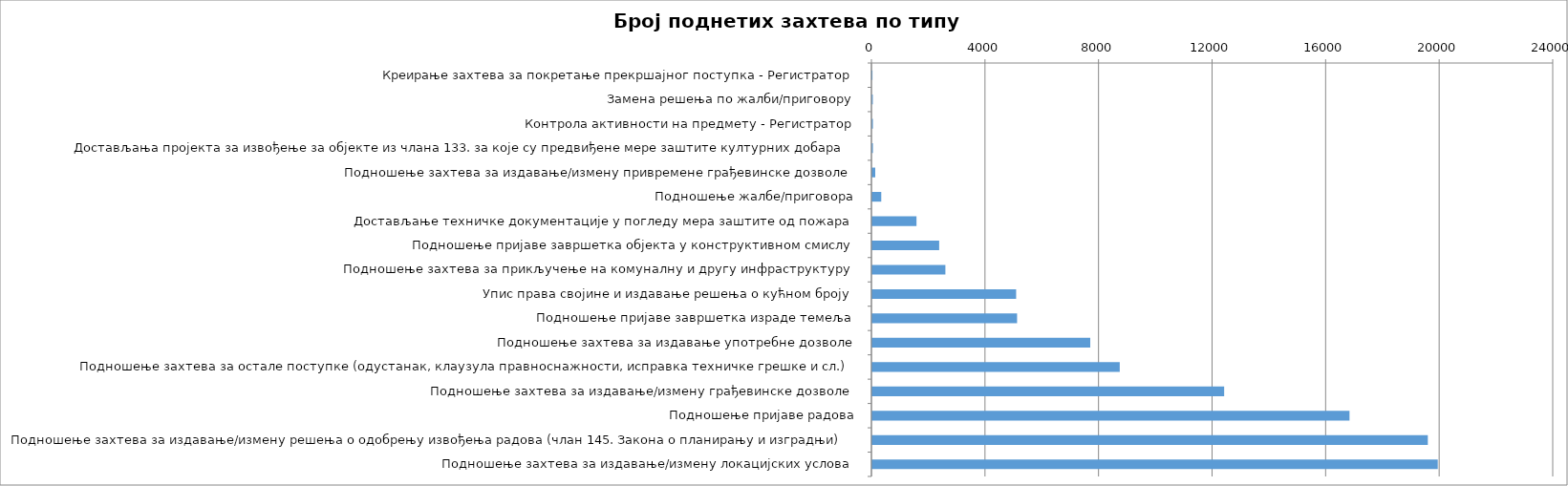
| Category | Број поднетих захтева |
|---|---|
| Креирање захтева за покретање прекршајног поступка - Регистратор | 3 |
| Замена решења по жалби/приговору | 14 |
| Контрола активности на предмету - Регистратор | 18 |
| Достављања пројекта за извођење за објекте из члана 133. за које су предвиђене мере заштите културних добара | 19 |
| Подношење захтева за издавање/измену привремене грађевинске дозволе | 102 |
| Подношење жалбе/приговора | 313 |
| Достављање техничке документације у погледу мера заштите од пожара | 1554 |
| Подношење пријаве завршетка објекта у конструктивном смислу | 2353 |
| Подношење захтева за прикључење на комуналну и другу инфраструктуру | 2572 |
| Упис права својине и издавање решења о кућном броју | 5064 |
| Подношење пријаве завршетка израде темеља | 5097 |
| Подношење захтева за издавање употребне дозволе | 7675 |
| Подношење захтева за остале поступке (одустанак, клаузула правноснажности, исправка техничке грешке и сл.) | 8714 |
| Подношење захтева за издавање/измену грађевинске дозволе | 12392 |
| Подношење пријаве радова | 16808 |
| Подношење захтева за издавање/измену решења о одобрењу извођења радова (члан 145. Закона о планирању и изградњи) | 19567 |
| Подношење захтева за издавање/измену локацијских услова | 19917 |